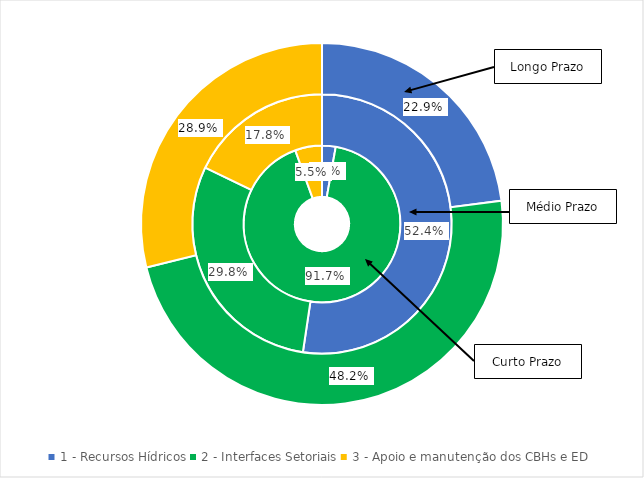
| Category | Curto Prazo (%) | Médio Prazo (%) | Longo Prazo (%) |
|---|---|---|---|
| 1 - Recursos Hídricos | 0.028 | 0.524 | 0.229 |
| 2 - Interfaces Setoriais | 0.917 | 0.298 | 0.482 |
| 3 - Apoio e manutenção dos CBHs e ED | 0.055 | 0.178 | 0.289 |